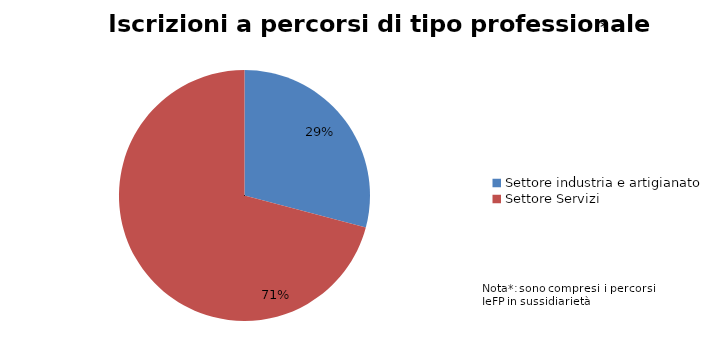
| Category | Series 0 |
|---|---|
| Settore industria e artigianato | 2174 |
| Settore Servizi | 5292 |